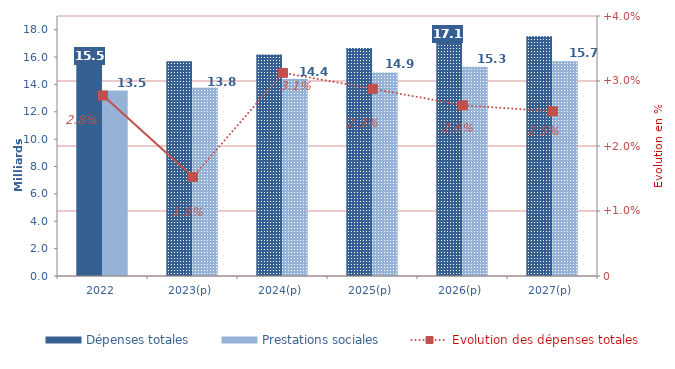
| Category | Dépenses totales | Prestations sociales |
|---|---|---|
| 2022 | 15462.592 | 13548.122 |
| 2023(p) | 15698.371 | 13782.118 |
| 2024(p) | 16189.017 | 14420.945 |
| 2025(p) | 16655.169 | 14871.296 |
| 2026(p) | 17092.588 | 15289.448 |
| 2027(p) | 17525.648 | 15701.727 |